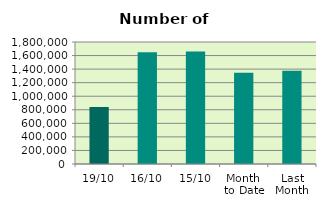
| Category | Series 0 |
|---|---|
| 19/10 | 841528 |
| 16/10 | 1647920 |
| 15/10 | 1659450 |
| Month 
to Date | 1344965.846 |
| Last
Month | 1376245.636 |